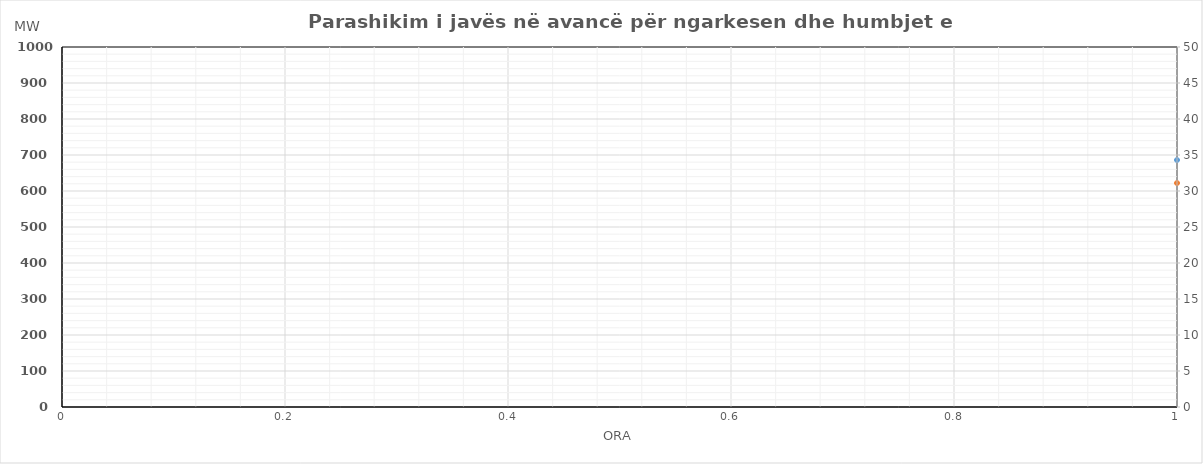
| Category | Ngarkesa (MWh) |
|---|---|
| 0 | 622.131 |
| 1 | 574.898 |
| 2 | 551.757 |
| 3 | 546.059 |
| 4 | 542.671 |
| 5 | 562.919 |
| 6 | 632.65 |
| 7 | 711.964 |
| 8 | 779.295 |
| 9 | 829.49 |
| 10 | 850.186 |
| 11 | 859.361 |
| 12 | 858.471 |
| 13 | 815.804 |
| 14 | 774.751 |
| 15 | 751.744 |
| 16 | 769.394 |
| 17 | 786.766 |
| 18 | 817.347 |
| 19 | 835.13 |
| 20 | 911.513 |
| 21 | 896.152 |
| 22 | 807.29 |
| 23 | 687.222 |
| 24 | 596.353 |
| 25 | 547.622 |
| 26 | 527.027 |
| 27 | 515.223 |
| 28 | 527.322 |
| 29 | 565.902 |
| 30 | 648.097 |
| 31 | 760.84 |
| 32 | 805.995 |
| 33 | 825.579 |
| 34 | 833.636 |
| 35 | 846.555 |
| 36 | 850.814 |
| 37 | 853.182 |
| 38 | 842.745 |
| 39 | 822.854 |
| 40 | 821.103 |
| 41 | 830.948 |
| 42 | 853.76 |
| 43 | 855.258 |
| 44 | 896.29 |
| 45 | 871.033 |
| 46 | 809.488 |
| 47 | 699.112 |
| 48 | 594.941 |
| 49 | 540.437 |
| 50 | 519.987 |
| 51 | 503.971 |
| 52 | 514.564 |
| 53 | 550.233 |
| 54 | 640.931 |
| 55 | 758.923 |
| 56 | 806.022 |
| 57 | 815.857 |
| 58 | 822.746 |
| 59 | 830.276 |
| 60 | 828.601 |
| 61 | 833.746 |
| 62 | 819.231 |
| 63 | 803.151 |
| 64 | 807.707 |
| 65 | 812.252 |
| 66 | 821.798 |
| 67 | 827.93 |
| 68 | 886.945 |
| 69 | 868.107 |
| 70 | 795.352 |
| 71 | 681.993 |
| 72 | 594.609 |
| 73 | 546.532 |
| 74 | 520.409 |
| 75 | 510.005 |
| 76 | 518.327 |
| 77 | 550.955 |
| 78 | 629.789 |
| 79 | 730.21 |
| 80 | 803.336 |
| 81 | 827.294 |
| 82 | 839.114 |
| 83 | 850.165 |
| 84 | 861.229 |
| 85 | 858.238 |
| 86 | 834.618 |
| 87 | 809.659 |
| 88 | 810.487 |
| 89 | 827.592 |
| 90 | 843.95 |
| 91 | 851.559 |
| 92 | 909.095 |
| 93 | 857.187 |
| 94 | 784.64 |
| 95 | 677.342 |
| 96 | 623.131 |
| 97 | 575.898 |
| 98 | 552.757 |
| 99 | 547.059 |
| 100 | 543.671 |
| 101 | 563.919 |
| 102 | 633.65 |
| 103 | 712.964 |
| 104 | 780.295 |
| 105 | 830.49 |
| 106 | 851.186 |
| 107 | 860.361 |
| 108 | 859.471 |
| 109 | 816.804 |
| 110 | 775.751 |
| 111 | 752.744 |
| 112 | 770.394 |
| 113 | 787.766 |
| 114 | 818.347 |
| 115 | 836.13 |
| 116 | 912.513 |
| 117 | 897.152 |
| 118 | 808.29 |
| 119 | 688.222 |
| 120 | 594.157 |
| 121 | 550.733 |
| 122 | 532.525 |
| 123 | 528.127 |
| 124 | 539.453 |
| 125 | 575.929 |
| 126 | 658.481 |
| 127 | 768.742 |
| 128 | 831.033 |
| 129 | 870.082 |
| 130 | 878.422 |
| 131 | 895.361 |
| 132 | 895.103 |
| 133 | 895.923 |
| 134 | 872.078 |
| 135 | 849.257 |
| 136 | 836.438 |
| 137 | 856.742 |
| 138 | 863.005 |
| 139 | 868.465 |
| 140 | 912.314 |
| 141 | 888.845 |
| 142 | 786.223 |
| 143 | 685.713 |
| 144 | 619.131 |
| 145 | 571.898 |
| 146 | 548.757 |
| 147 | 543.059 |
| 148 | 539.671 |
| 149 | 559.919 |
| 150 | 629.65 |
| 151 | 708.964 |
| 152 | 776.295 |
| 153 | 826.49 |
| 154 | 847.186 |
| 155 | 856.361 |
| 156 | 855.471 |
| 157 | 812.804 |
| 158 | 771.751 |
| 159 | 748.744 |
| 160 | 766.394 |
| 161 | 783.766 |
| 162 | 814.347 |
| 163 | 832.13 |
| 164 | 908.513 |
| 165 | 893.152 |
| 166 | 804.29 |
| 167 | 684.222 |